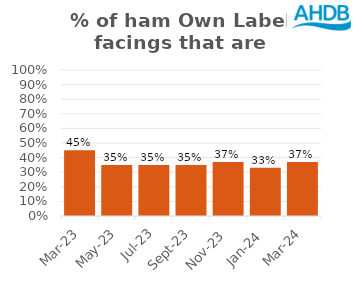
| Category | Ham |
|---|---|
| 2023-03-01 | 0.45 |
| 2023-05-01 | 0.35 |
| 2023-07-01 | 0.35 |
| 2023-09-01 | 0.35 |
| 2023-11-01 | 0.37 |
| 2024-01-01 | 0.33 |
| 2024-03-01 | 0.37 |